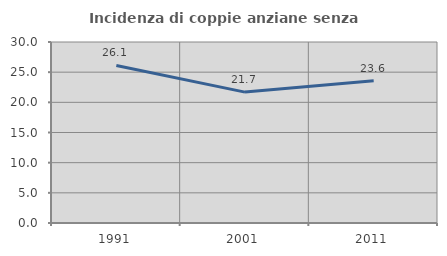
| Category | Incidenza di coppie anziane senza figli  |
|---|---|
| 1991.0 | 26.108 |
| 2001.0 | 21.693 |
| 2011.0 | 23.596 |